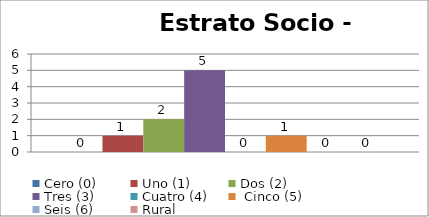
| Category | Cero (0) | Uno (1)   | Dos (2) | Tres (3) | Cuatro (4) |  Cinco (5) | Seis (6) | Rural |
|---|---|---|---|---|---|---|---|---|
| 0 | 0 | 1 | 2 | 5 | 0 | 1 | 0 | 0 |